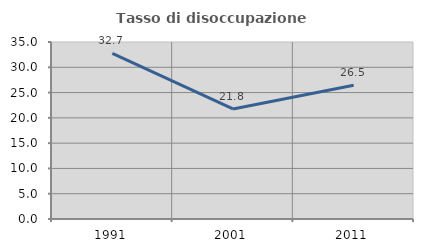
| Category | Tasso di disoccupazione giovanile  |
|---|---|
| 1991.0 | 32.745 |
| 2001.0 | 21.767 |
| 2011.0 | 26.463 |